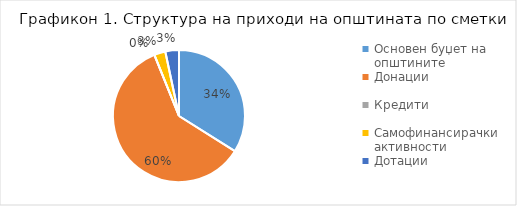
| Category | Структура |
|---|---|
| Основен буџет на општините | 33.948 |
| Донации | 59.96 |
| Кредити | 0 |
| Самофинансирачки активности | 2.75 |
| Дотации | 3.342 |